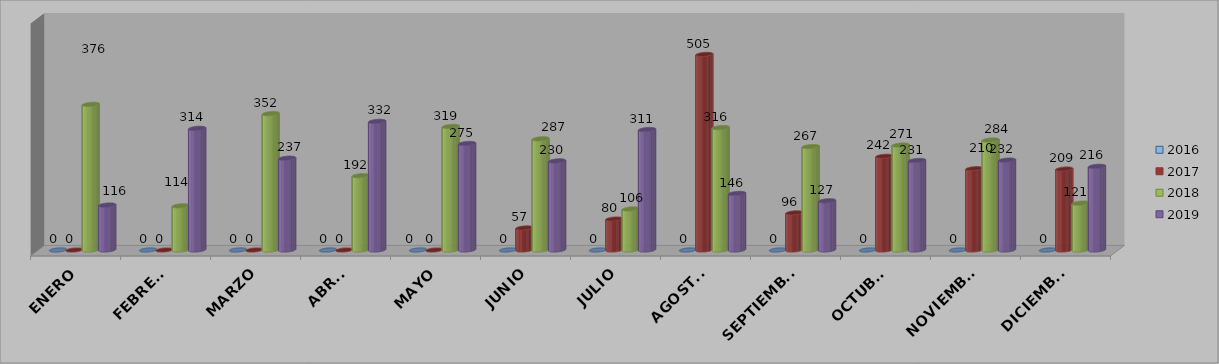
| Category | 2016 | 2017 | 2018 | 2019 |
|---|---|---|---|---|
| ENERO | 0 | 0 | 376 | 116 |
| FEBRERO | 0 | 0 | 114 | 314 |
| MARZO | 0 | 0 | 352 | 237 |
| ABRIL | 0 | 0 | 192 | 332 |
| MAYO | 0 | 0 | 319 | 275 |
| JUNIO | 0 | 57 | 287 | 230 |
| JULIO | 0 | 80 | 106 | 311 |
| AGOSTO | 0 | 505 | 316 | 146 |
| SEPTIEMBRE | 0 | 96 | 267 | 127 |
| OCTUBRE | 0 | 242 | 271 | 231 |
| NOVIEMBRE | 0 | 210 | 284 | 232 |
| DICIEMBRE | 0 | 209 | 121 | 216 |